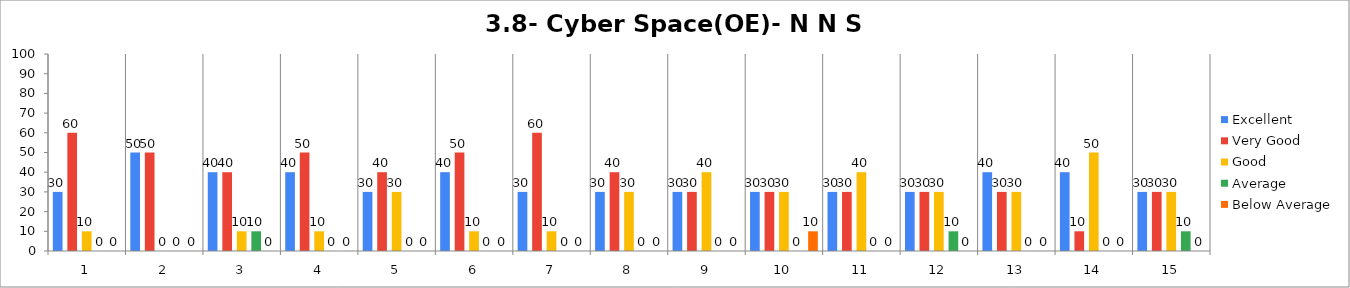
| Category | Excellent | Very Good | Good | Average | Below Average |
|---|---|---|---|---|---|
| 0 | 30 | 60 | 10 | 0 | 0 |
| 1 | 50 | 50 | 0 | 0 | 0 |
| 2 | 40 | 40 | 10 | 10 | 0 |
| 3 | 40 | 50 | 10 | 0 | 0 |
| 4 | 30 | 40 | 30 | 0 | 0 |
| 5 | 40 | 50 | 10 | 0 | 0 |
| 6 | 30 | 60 | 10 | 0 | 0 |
| 7 | 30 | 40 | 30 | 0 | 0 |
| 8 | 30 | 30 | 40 | 0 | 0 |
| 9 | 30 | 30 | 30 | 0 | 10 |
| 10 | 30 | 30 | 40 | 0 | 0 |
| 11 | 30 | 30 | 30 | 10 | 0 |
| 12 | 40 | 30 | 30 | 0 | 0 |
| 13 | 40 | 10 | 50 | 0 | 0 |
| 14 | 30 | 30 | 30 | 10 | 0 |